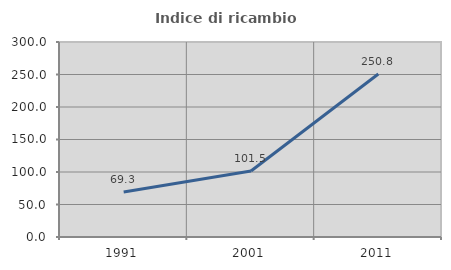
| Category | Indice di ricambio occupazionale  |
|---|---|
| 1991.0 | 69.34 |
| 2001.0 | 101.535 |
| 2011.0 | 250.794 |